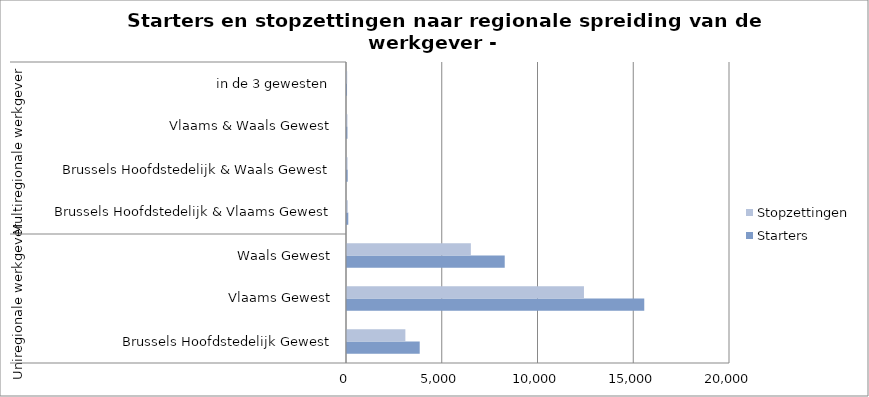
| Category | Starters | Stopzettingen |
|---|---|---|
| 0 | 3797 | 3048 |
| 1 | 15523 | 12374 |
| 2 | 8236 | 6468 |
| 3 | 67 | 37 |
| 4 | 37 | 28 |
| 5 | 24 | 22 |
| 6 | 2 | 10 |